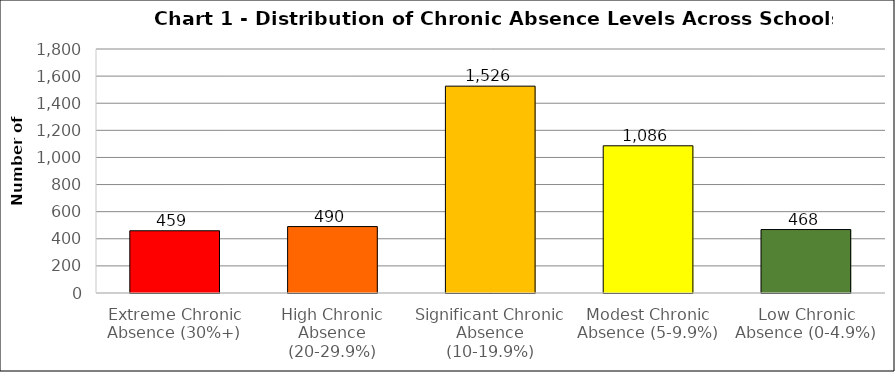
| Category | Series 0 |
|---|---|
| Extreme Chronic Absence (30%+) | 459 |
| High Chronic Absence (20-29.9%) | 490 |
| Significant Chronic Absence (10-19.9%) | 1526 |
| Modest Chronic Absence (5-9.9%) | 1086 |
| Low Chronic Absence (0-4.9%) | 468 |